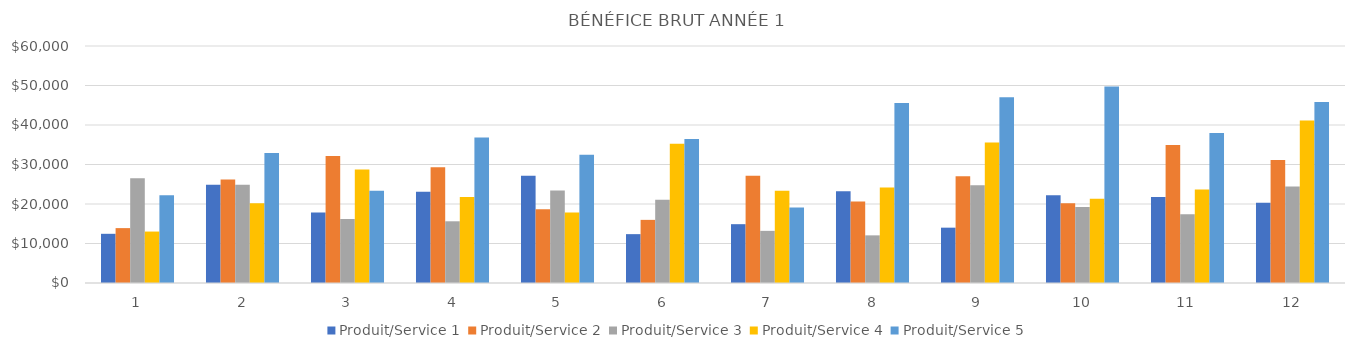
| Category | Produit/Service 1 | Produit/Service 2 | Produit/Service 3 | Produit/Service 4 | Produit/Service 5 |
|---|---|---|---|---|---|
| 0 | 12453 | 13896 | 26541 | 13024 | 22200 |
| 1 | 24899 | 26232 | 24858 | 20218 | 32880 |
| 2 | 17822 | 32152 | 16218 | 28743 | 23385 |
| 3 | 23107.5 | 29287.5 | 15623 | 21766.5 | 36815.5 |
| 4 | 27131 | 18660 | 23400.5 | 17871 | 32465.5 |
| 5 | 12369.5 | 15982.5 | 21063 | 35238 | 36438.5 |
| 6 | 14891.5 | 27142.5 | 13200.5 | 23331 | 19140 |
| 7 | 23211.5 | 20602.5 | 12061.5 | 24202.5 | 45559 |
| 8 | 14007.5 | 27052.5 | 24726.5 | 35595 | 47052.5 |
| 9 | 22218 | 20160 | 19233 | 21329 | 49770 |
| 10 | 21780 | 34920 | 17376 | 23647 | 38000 |
| 11 | 20340 | 31170 | 24420 | 41158 | 45840 |